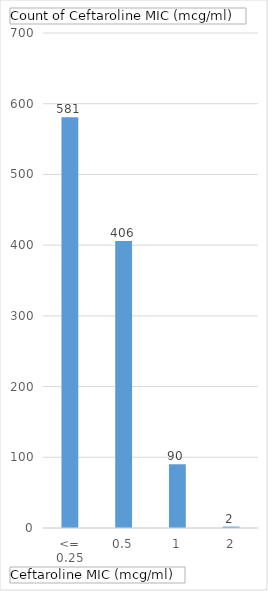
| Category | Total |
|---|---|
| <= 0.25 | 581 |
| 0.5 | 406 |
| 1 | 90 |
| 2 | 2 |